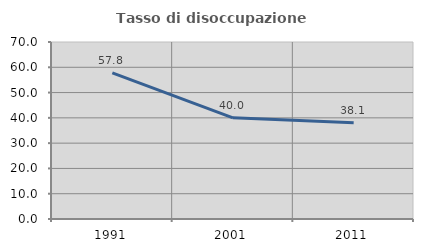
| Category | Tasso di disoccupazione giovanile  |
|---|---|
| 1991.0 | 57.823 |
| 2001.0 | 40 |
| 2011.0 | 38.095 |